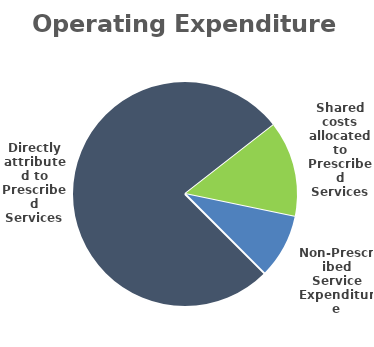
| Category | Series 0 |
|---|---|
| Directly attributed to Prescribed Services | 113.552 |
| Shared costs allocated to Prescribed Services | 20.364 |
| Non-Prescribed Service Expenditure | 13.615 |